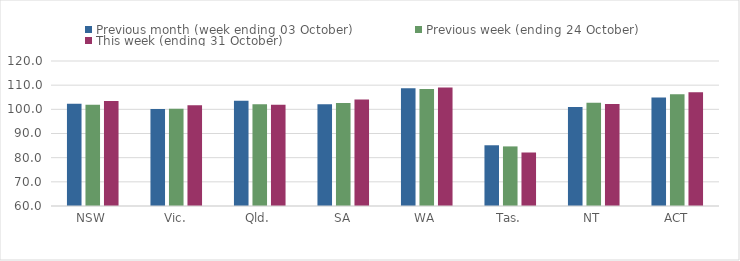
| Category | Previous month (week ending 03 October) | Previous week (ending 24 October) | This week (ending 31 October) |
|---|---|---|---|
| NSW | 102.32 | 101.87 | 103.43 |
| Vic. | 100.09 | 100.26 | 101.74 |
| Qld. | 103.56 | 102.08 | 101.87 |
| SA | 102.09 | 102.63 | 104.09 |
| WA | 108.74 | 108.41 | 109.06 |
| Tas. | 85.13 | 84.66 | 82.14 |
| NT | 100.92 | 102.76 | 102.19 |
| ACT | 104.94 | 106.27 | 107.04 |